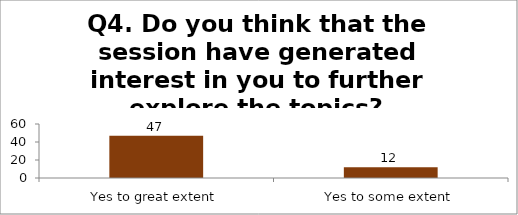
| Category | Q4. Do you think that the session have generated interest in you to further explore the topics? |
|---|---|
| Yes to great extent | 47 |
| Yes to some extent | 12 |